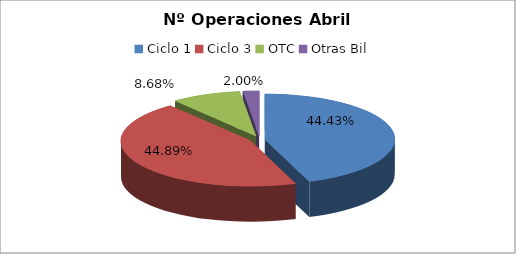
| Category | Series 0 |
|---|---|
| Ciclo 1 | 44744 |
| Ciclo 3 | 45214 |
| OTC | 8739 |
| Otras Bil | 2016 |